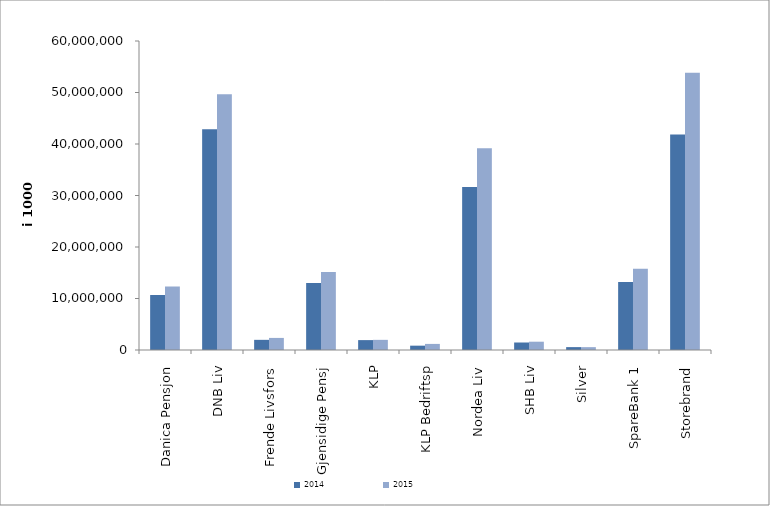
| Category | 2014 | 2015 |
|---|---|---|
| Danica Pensjon | 10675331.241 | 12330572.925 |
| DNB Liv | 42866368.77 | 49679142.28 |
| Frende Livsfors | 1971562 | 2345808 |
| Gjensidige Pensj | 13009567.626 | 15155471 |
| KLP | 1920558.255 | 1969739.411 |
| KLP Bedriftsp | 841905 | 1182480 |
| Nordea Liv | 31663855 | 39157649.861 |
| SHB Liv | 1456079 | 1610956 |
| Silver | 559243.537 | 554655.763 |
| SpareBank 1 | 13190434.448 | 15766545.601 |
| Storebrand | 41820452.408 | 53833907.768 |